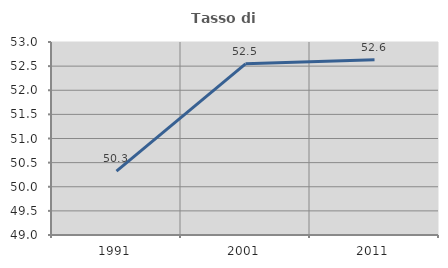
| Category | Tasso di occupazione   |
|---|---|
| 1991.0 | 50.322 |
| 2001.0 | 52.548 |
| 2011.0 | 52.633 |